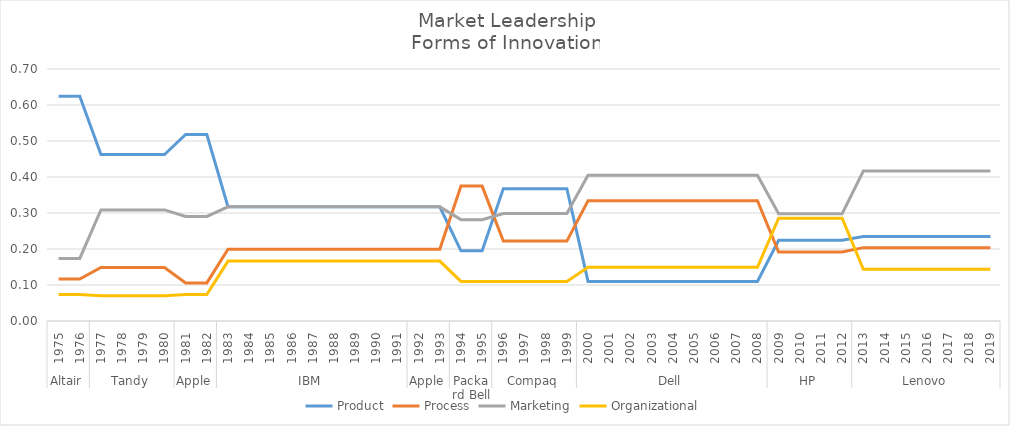
| Category | Product | Process | Marketing | Organizational |
|---|---|---|---|---|
| 0 | 0.624 | 0.117 | 0.174 | 0.073 |
| 1 | 0.624 | 0.117 | 0.174 | 0.073 |
| 2 | 0.462 | 0.149 | 0.309 | 0.07 |
| 3 | 0.462 | 0.149 | 0.309 | 0.07 |
| 4 | 0.462 | 0.149 | 0.309 | 0.07 |
| 5 | 0.462 | 0.149 | 0.309 | 0.07 |
| 6 | 0.518 | 0.106 | 0.29 | 0.074 |
| 7 | 0.518 | 0.106 | 0.29 | 0.074 |
| 8 | 0.317 | 0.199 | 0.317 | 0.166 |
| 9 | 0.317 | 0.199 | 0.317 | 0.166 |
| 10 | 0.317 | 0.199 | 0.317 | 0.166 |
| 11 | 0.317 | 0.199 | 0.317 | 0.166 |
| 12 | 0.317 | 0.199 | 0.317 | 0.166 |
| 13 | 0.317 | 0.199 | 0.317 | 0.166 |
| 14 | 0.317 | 0.199 | 0.317 | 0.166 |
| 15 | 0.317 | 0.199 | 0.317 | 0.166 |
| 16 | 0.317 | 0.199 | 0.317 | 0.166 |
| 17 | 0.317 | 0.199 | 0.317 | 0.166 |
| 18 | 0.317 | 0.199 | 0.317 | 0.166 |
| 19 | 0.195 | 0.375 | 0.282 | 0.11 |
| 20 | 0.195 | 0.375 | 0.282 | 0.11 |
| 21 | 0.368 | 0.222 | 0.299 | 0.11 |
| 22 | 0.368 | 0.222 | 0.299 | 0.11 |
| 23 | 0.368 | 0.222 | 0.299 | 0.11 |
| 24 | 0.368 | 0.222 | 0.299 | 0.11 |
| 25 | 0.11 | 0.334 | 0.405 | 0.149 |
| 26 | 0.11 | 0.334 | 0.405 | 0.149 |
| 27 | 0.11 | 0.334 | 0.405 | 0.149 |
| 28 | 0.11 | 0.334 | 0.405 | 0.149 |
| 29 | 0.11 | 0.334 | 0.405 | 0.149 |
| 30 | 0.11 | 0.334 | 0.405 | 0.149 |
| 31 | 0.11 | 0.334 | 0.405 | 0.149 |
| 32 | 0.11 | 0.334 | 0.405 | 0.149 |
| 33 | 0.11 | 0.334 | 0.405 | 0.149 |
| 34 | 0.224 | 0.192 | 0.298 | 0.286 |
| 35 | 0.224 | 0.192 | 0.298 | 0.286 |
| 36 | 0.224 | 0.192 | 0.298 | 0.286 |
| 37 | 0.224 | 0.192 | 0.298 | 0.286 |
| 38 | 0.235 | 0.204 | 0.417 | 0.143 |
| 39 | 0.235 | 0.204 | 0.417 | 0.143 |
| 40 | 0.235 | 0.204 | 0.417 | 0.143 |
| 41 | 0.235 | 0.204 | 0.417 | 0.143 |
| 42 | 0.235 | 0.204 | 0.417 | 0.143 |
| 43 | 0.235 | 0.204 | 0.417 | 0.143 |
| 44 | 0.235 | 0.204 | 0.417 | 0.143 |